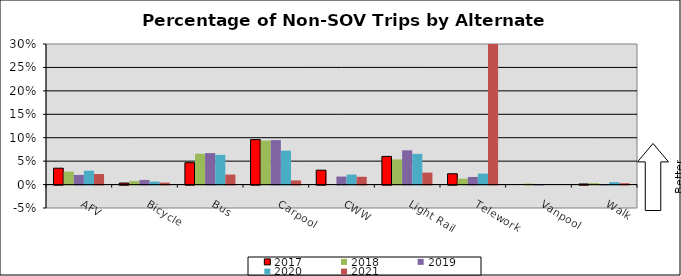
| Category | 2017 | 2018 | 2019 | 2020 | 2021 |
|---|---|---|---|---|---|
| AFV | 0.035 | 0.028 | 0.021 | 0.03 | 0.023 |
| Bicycle | 0.003 | 0.007 | 0.01 | 0.006 | 0.004 |
| Bus | 0.047 | 0.066 | 0.067 | 0.063 | 0.021 |
| Carpool | 0.096 | 0.094 | 0.095 | 0.072 | 0.009 |
| CWW | 0.031 | 0 | 0.017 | 0.021 | 0.017 |
| Light Rail | 0.06 | 0.054 | 0.073 | 0.066 | 0.026 |
| Telework | 0.023 | 0.013 | 0.016 | 0.023 | 0.542 |
| Vanpool | 0 | 0.002 | 0 | 0 | 0 |
| Walk | 0.001 | 0.003 | 0 | 0.005 | 0.003 |